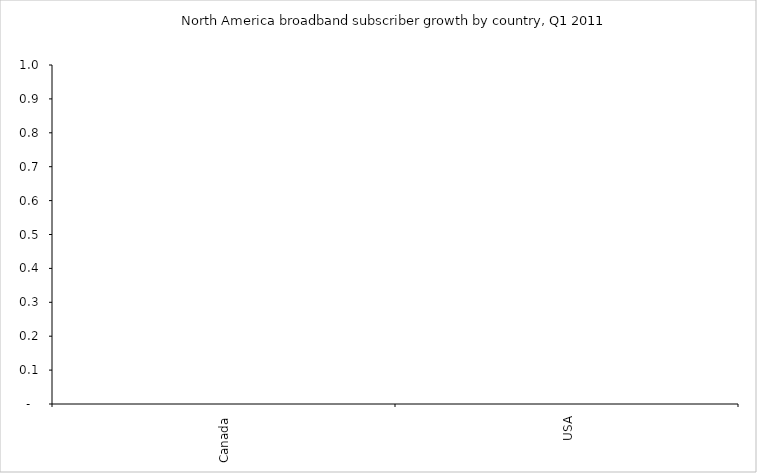
| Category | Series 3 |
|---|---|
| Canada | 0 |
| USA | 0 |